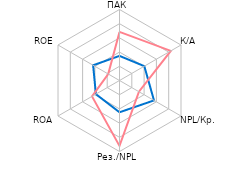
| Category | Србија | Регион |
|---|---|---|
| ПАК | 1.732 | 3.42 |
| К/А | 2.018 | 4.172 |
| NPL/Кр. | 2.804 | 1.582 |
| Рез./NPL | 2.238 | 4.607 |
| ROA | 1.92 | 2.235 |
| ROE | 2.146 | 0.918 |